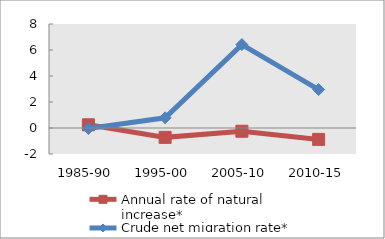
| Category | Annual rate of natural increase* | Crude net migration rate* |
|---|---|---|
| 1985-90 | 0.247 | -0.035 |
| 1995-00 | -0.72 | 0.786 |
| 2005-10 | -0.249 | 6.415 |
| 2010-15 | -0.877 | 2.959 |